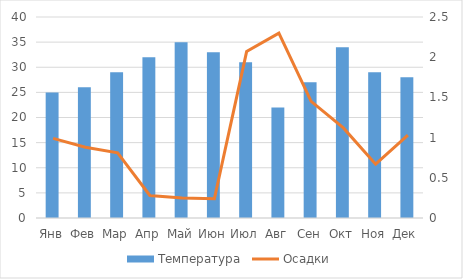
| Category | Температура |
|---|---|
| Янв | 25 |
| Фев | 26 |
| Мар | 29 |
| Апр | 32 |
| Май | 35 |
| Июн | 33 |
| Июл | 31 |
| Авг | 22 |
| Сен | 27 |
| Окт | 34 |
| Ноя | 29 |
| Дек | 28 |